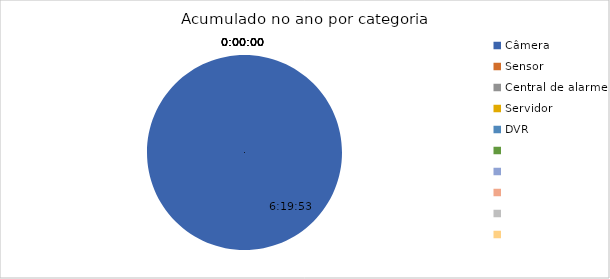
| Category | Total |
|---|---|
| Câmera | 0.264 |
| Sensor | 0 |
| Central de alarme | 0 |
| Servidor | 0 |
| DVR | 0 |